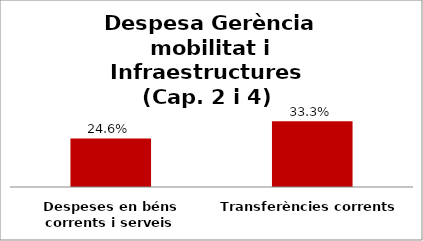
| Category | Series 0 |
|---|---|
| Despeses en béns corrents i serveis | 0.246 |
| Transferències corrents | 0.333 |